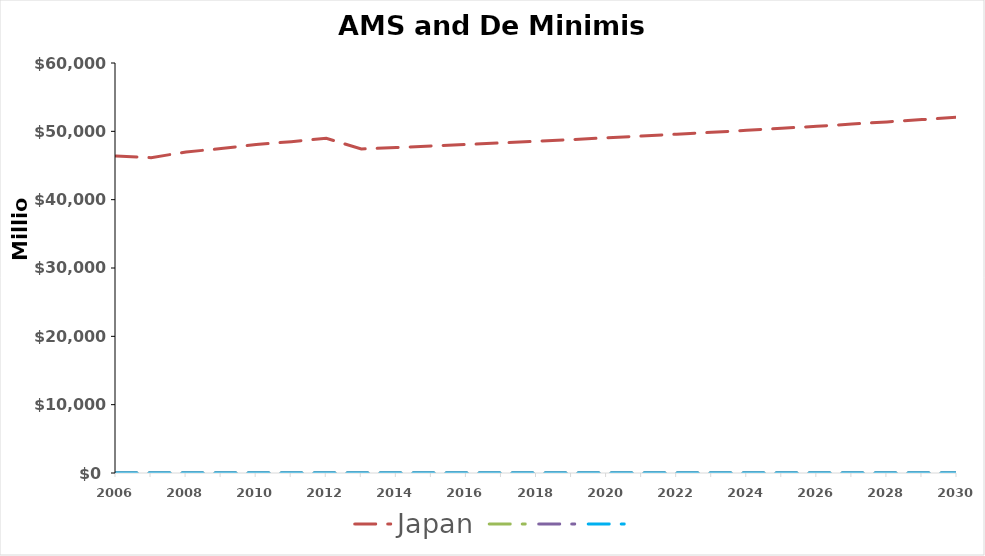
| Category | Japan | Series 2 | Series 3 | Series 4 |
|---|---|---|---|---|
| 2006.0 | 46384205111.953 | 0 | 0 | 0 |
| 2007.0 | 46139829111.953 | 0 | 0 | 0 |
| 2008.0 | 46988349111.953 | 0 | 0 | 0 |
| 2009.0 | 47470963111.953 | 0 | 0 | 0 |
| 2010.0 | 48067160111.953 | 0 | 0 | 0 |
| 2011.0 | 48491804111.953 | 0 | 0 | 0 |
| 2012.0 | 48991799111.953 | 0 | 0 | 0 |
| 2013.0 | 47412534111.953 | 0 | 0 | 0 |
| 2014.0 | 47625976401.953 | 0 | 0 | 0 |
| 2015.0 | 47845821960.653 | 0 | 0 | 0 |
| 2016.0 | 48072262886.114 | 0 | 0 | 0 |
| 2017.0 | 48305497039.339 | 0 | 0 | 0 |
| 2018.0 | 48545728217.161 | 0 | 0 | 0 |
| 2019.0 | 48793166330.317 | 0 | 0 | 0 |
| 2020.0 | 49048027586.868 | 0 | 0 | 0 |
| 2021.0 | 49310534681.115 | 0 | 0 | 0 |
| 2022.0 | 49580916988.19 | 0 | 0 | 0 |
| 2023.0 | 49859410764.477 | 0 | 0 | 0 |
| 2024.0 | 50146259354.053 | 0 | 0 | 0 |
| 2025.0 | 50441713401.316 | 0 | 0 | 0 |
| 2026.0 | 50746031069.997 | 0 | 0 | 0 |
| 2027.0 | 51059478268.738 | 0 | 0 | 0 |
| 2028.0 | 51382328883.442 | 0 | 0 | 0 |
| 2029.0 | 51714865016.586 | 0 | 0 | 0 |
| 2030.0 | 52057377233.725 | 0 | 0 | 0 |